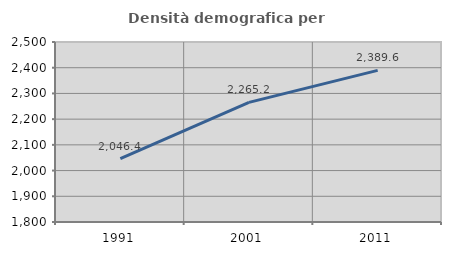
| Category | Densità demografica |
|---|---|
| 1991.0 | 2046.416 |
| 2001.0 | 2265.215 |
| 2011.0 | 2389.63 |